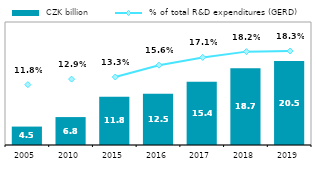
| Category |  CZK billion |
|---|---|
| 2005.0 | 4.492 |
| 2010.0 | 6.811 |
| 2015.0 | 11.763 |
| 2016.0 | 12.477 |
| 2017.0 | 15.448 |
| 2018.0 | 18.72 |
| 2019.0 | 20.474 |